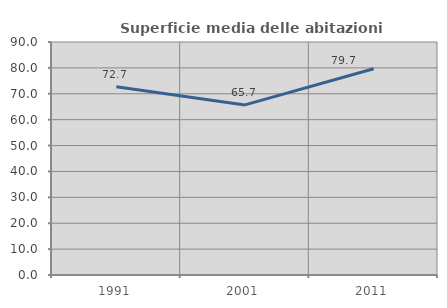
| Category | Superficie media delle abitazioni occupate |
|---|---|
| 1991.0 | 72.682 |
| 2001.0 | 65.701 |
| 2011.0 | 79.661 |